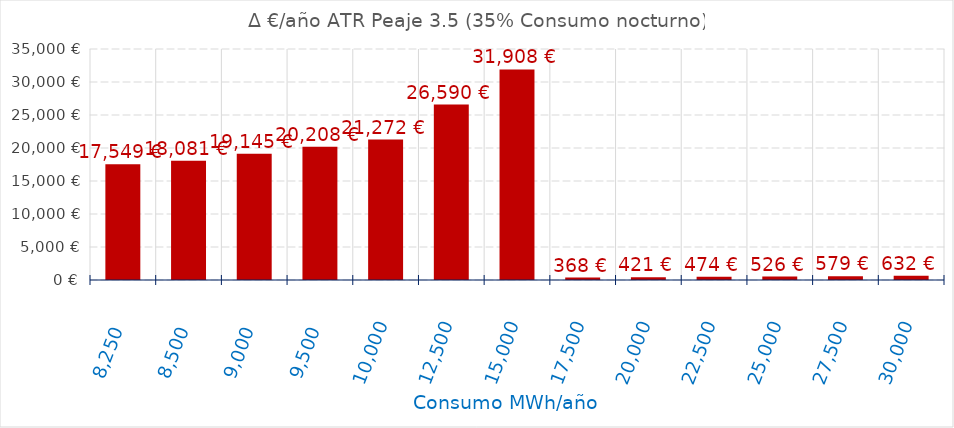
| Category | D €/año |
|---|---|
| 8250.0 | 17549.217 |
| 8500.0 | 18081.011 |
| 9000.0 | 19144.6 |
| 9500.0 | 20208.189 |
| 10000.0 | 21271.778 |
| 12500.0 | 26589.723 |
| 15000.0 | 31907.667 |
| 17500.0 | 368.384 |
| 20000.0 | 421.01 |
| 22500.0 | 473.636 |
| 25000.0 | 526.262 |
| 27500.0 | 578.888 |
| 30000.0 | 631.515 |